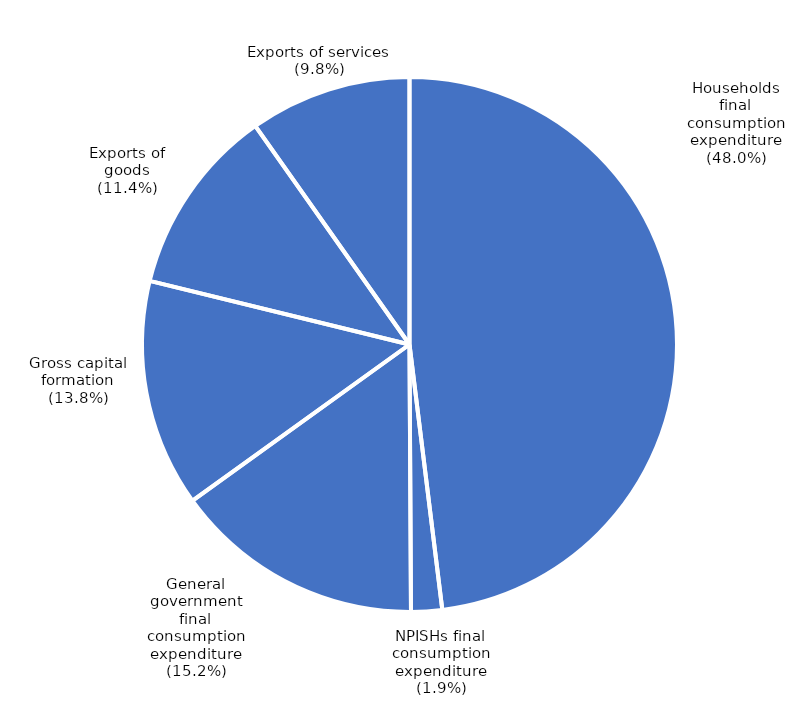
| Category | Series 0 |
|---|---|
| Households
final
consumption
expenditure | 1187215 |
| NPISHs final
consumption
expenditure | 46231 |
| General
government
final
consumption
expenditure | 374650 |
| Gross capital
formation | 339817 |
| Exports of
goods | 281689 |
| Exports of services | 241677 |